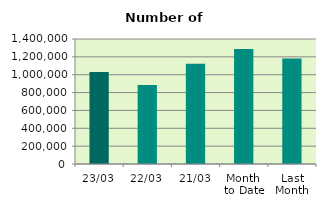
| Category | Series 0 |
|---|---|
| 23/03 | 1031204 |
| 22/03 | 883830 |
| 21/03 | 1123880 |
| Month 
to Date | 1287375.765 |
| Last
Month | 1180310.4 |